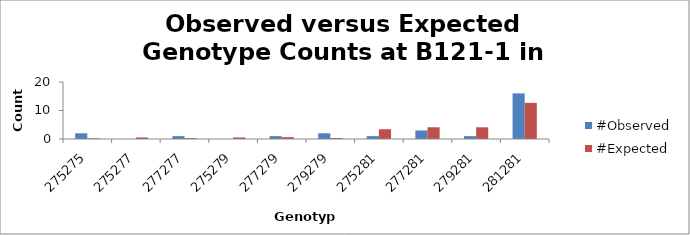
| Category | #Observed | #Expected |
|---|---|---|
| 275275.0 | 2 | 0.231 |
| 275277.0 | 0 | 0.556 |
| 277277.0 | 1 | 0.333 |
| 275279.0 | 0 | 0.556 |
| 277279.0 | 1 | 0.667 |
| 279279.0 | 2 | 0.333 |
| 275281.0 | 1 | 3.426 |
| 277281.0 | 3 | 4.111 |
| 279281.0 | 1 | 4.111 |
| 281281.0 | 16 | 12.676 |